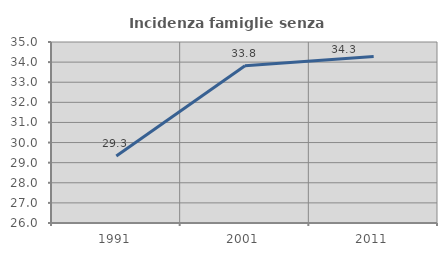
| Category | Incidenza famiglie senza nuclei |
|---|---|
| 1991.0 | 29.331 |
| 2001.0 | 33.814 |
| 2011.0 | 34.284 |